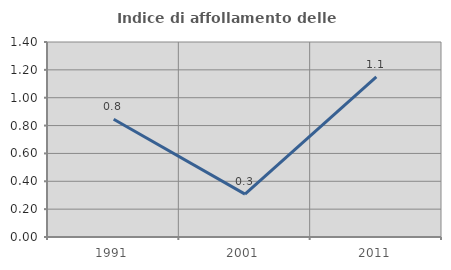
| Category | Indice di affollamento delle abitazioni  |
|---|---|
| 1991.0 | 0.845 |
| 2001.0 | 0.308 |
| 2011.0 | 1.149 |